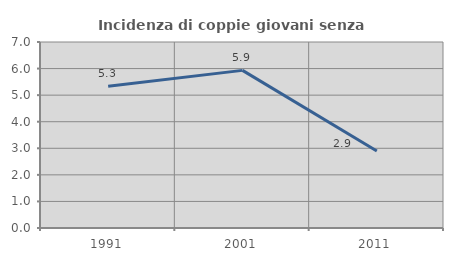
| Category | Incidenza di coppie giovani senza figli |
|---|---|
| 1991.0 | 5.337 |
| 2001.0 | 5.932 |
| 2011.0 | 2.899 |